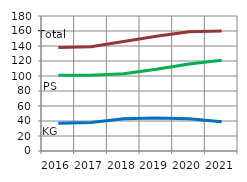
| Category | Total | Kindergarten | Primarstufe |
|---|---|---|---|
| 2016.0 | 138 | 37 | 101 |
| 2017.0 | 139 | 38 | 101 |
| 2018.0 | 146 | 43 | 103 |
| 2019.0 | 153 | 44 | 109 |
| 2020.0 | 159 | 43 | 116 |
| 2021.0 | 160 | 39 | 121 |